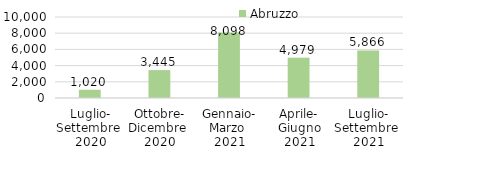
| Category | Abruzzo |
|---|---|
| Luglio-
Settembre 
2020 | 1019.989 |
| Ottobre-
Dicembre 
2020 | 3444.891 |
| Gennaio-
Marzo 
2021 | 8097.711 |
| Aprile-
Giugno
2021 | 4978.78 |
| Luglio-
Settembre 
2021 | 5865.63 |